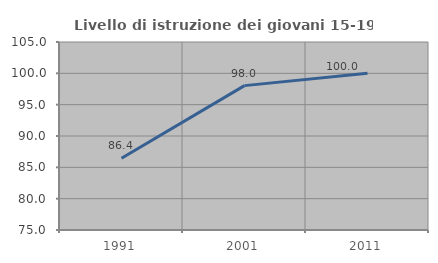
| Category | Livello di istruzione dei giovani 15-19 anni |
|---|---|
| 1991.0 | 86.441 |
| 2001.0 | 98.039 |
| 2011.0 | 100 |